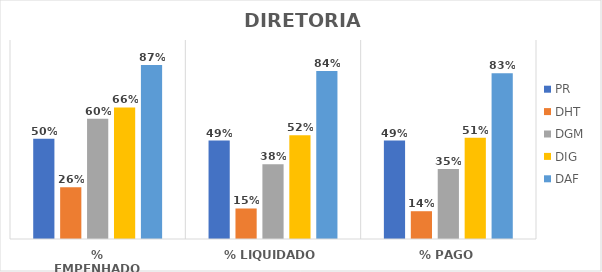
| Category | PR | DHT | DGM | DIG | DAF |
|---|---|---|---|---|---|
| % EMPENHADO | 0.503 | 0.26 | 0.604 | 0.661 | 0.875 |
| % LIQUIDADO | 0.495 | 0.153 | 0.376 | 0.521 | 0.844 |
| % PAGO | 0.494 | 0.14 | 0.352 | 0.509 | 0.833 |